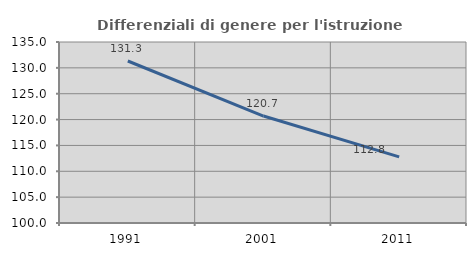
| Category | Differenziali di genere per l'istruzione superiore |
|---|---|
| 1991.0 | 131.326 |
| 2001.0 | 120.687 |
| 2011.0 | 112.792 |